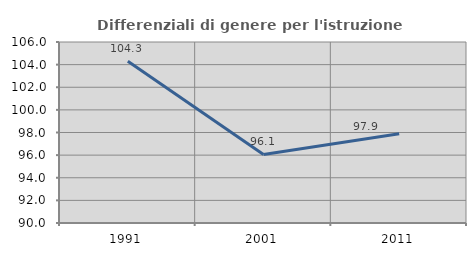
| Category | Differenziali di genere per l'istruzione superiore |
|---|---|
| 1991.0 | 104.292 |
| 2001.0 | 96.055 |
| 2011.0 | 97.898 |